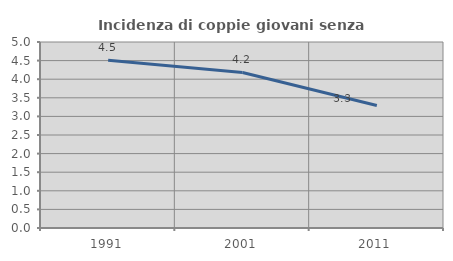
| Category | Incidenza di coppie giovani senza figli |
|---|---|
| 1991.0 | 4.507 |
| 2001.0 | 4.182 |
| 2011.0 | 3.294 |